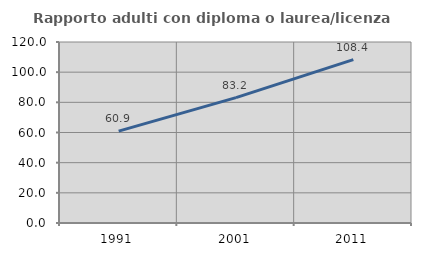
| Category | Rapporto adulti con diploma o laurea/licenza media  |
|---|---|
| 1991.0 | 60.909 |
| 2001.0 | 83.158 |
| 2011.0 | 108.356 |